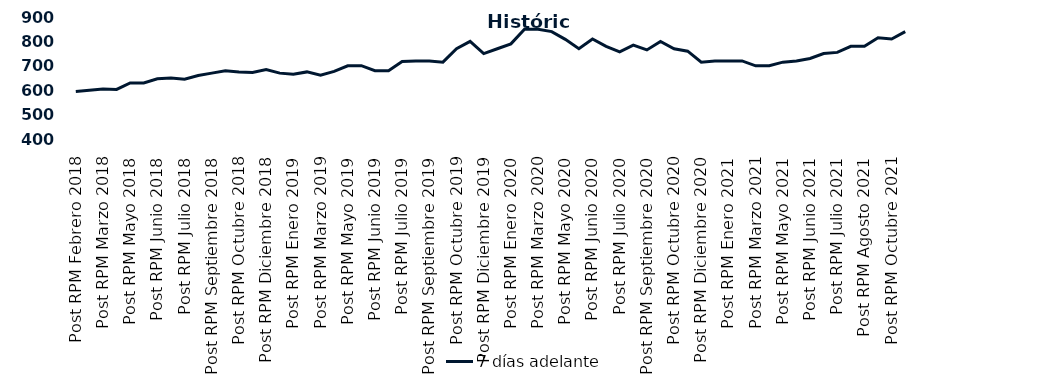
| Category | 7 días adelante  |
|---|---|
| Post RPM Febrero 2018 | 595 |
| Pre RPM Marzo 2018 | 600 |
| Post RPM Marzo 2018 | 605 |
| Pre RPM Mayo 2018 | 603 |
| Post RPM Mayo 2018 | 630 |
| Pre RPM Junio 2018 | 630 |
| Post RPM Junio 2018 | 646.5 |
| Pre RPM Julio 2018 | 650 |
| Post RPM Julio 2018 | 645 |
| Pre RPM Septiembre 2018 | 660 |
| Post RPM Septiembre 2018 | 670 |
| Pre RPM Octubre 2018 | 680 |
| Post RPM Octubre 2018 | 675 |
| Pre RPM Diciembre 2018 | 672.5 |
| Post RPM Diciembre 2018 | 685 |
| Pre RPM Enero 2019 | 670 |
| Post RPM Enero 2019 | 665 |
| Pre RPM Marzo 2019 | 675 |
| Post RPM Marzo 2019 | 661 |
| Pre RPM Mayo 2019 | 677 |
| Post RPM Mayo 2019 | 700 |
| Pre RPM Junio 2019 | 700.5 |
| Post RPM Junio 2019 | 680 |
| Pre RPM Julio 2019 | 680 |
| Post RPM Julio 2019 | 717.5 |
| Pre RPM Septiembre 2019 | 720 |
| Post RPM Septiembre 2019 | 720 |
| Pre RPM Octubre 2019 | 715 |
| Post RPM Octubre 2019 | 770 |
| Pre RPM Diciembre 2019 | 800 |
| Post RPM Diciembre 2019 | 750 |
| Pre RPM Enero 2020 | 770 |
| Post RPM Enero 2020 | 790 |
| Pre RPM Marzo 2020 | 850 |
| Post RPM Marzo 2020 | 850 |
| Pre RPM Mayo 2020 | 840 |
| Post RPM Mayo 2020 | 808.5 |
| Pre RPM Junio 2020 | 770 |
| Post RPM Junio 2020 | 810 |
| Pre RPM Julio 2020 | 780 |
| Post RPM Julio 2020 | 757 |
| Pre RPM Septiembre 2020 | 785 |
| Post RPM Septiembre 2020 | 765 |
| Pre RPM Octubre 2020 | 800 |
| Post RPM Octubre 2020 | 770 |
| Pre RPM Diciembre 2020 | 760 |
| Post RPM Diciembre 2020 | 715 |
| Pre RPM Enero 2021 | 720 |
| Post RPM Enero 2021 | 720 |
| Pre RPM Marzo 2021 | 720 |
| Post RPM Marzo 2021 | 700 |
| Pre RPM Mayo 2021 | 700 |
| Post RPM Mayo 2021 | 715 |
| Pre RPM Junio 2021 | 720 |
| Post RPM Junio 2021 | 730 |
| Pre RPM Julio 2021 | 750 |
| Post RPM Julio 2021 | 755 |
| Pre RPM Agosto 2021 | 780 |
| Post RPM Agosto 2021 | 780 |
| Pre RPM Octubre 2021 | 815 |
| Post RPM Octubre 2021 | 810 |
| Pre RPM Diciembre 2021 | 840 |